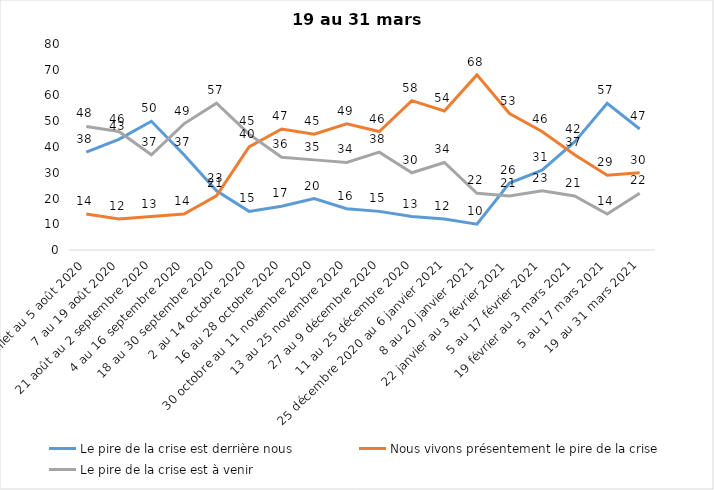
| Category | Le pire de la crise est derrière nous | Nous vivons présentement le pire de la crise | Le pire de la crise est à venir |
|---|---|---|---|
| 24 juillet au 5 août 2020 | 38 | 14 | 48 |
| 7 au 19 août 2020 | 43 | 12 | 46 |
| 21 août au 2 septembre 2020 | 50 | 13 | 37 |
| 4 au 16 septembre 2020 | 37 | 14 | 49 |
| 18 au 30 septembre 2020 | 23 | 21 | 57 |
| 2 au 14 octobre 2020 | 15 | 40 | 45 |
| 16 au 28 octobre 2020 | 17 | 47 | 36 |
| 30 octobre au 11 novembre 2020 | 20 | 45 | 35 |
| 13 au 25 novembre 2020 | 16 | 49 | 34 |
| 27 au 9 décembre 2020 | 15 | 46 | 38 |
| 11 au 25 décembre 2020 | 13 | 58 | 30 |
| 25 décembre 2020 au 6 janvier 2021 | 12 | 54 | 34 |
| 8 au 20 janvier 2021 | 10 | 68 | 22 |
| 22 janvier au 3 février 2021 | 26 | 53 | 21 |
| 5 au 17 février 2021 | 31 | 46 | 23 |
| 19 février au 3 mars 2021 | 42 | 37 | 21 |
| 5 au 17 mars 2021 | 57 | 29 | 14 |
| 19 au 31 mars 2021 | 47 | 30 | 22 |